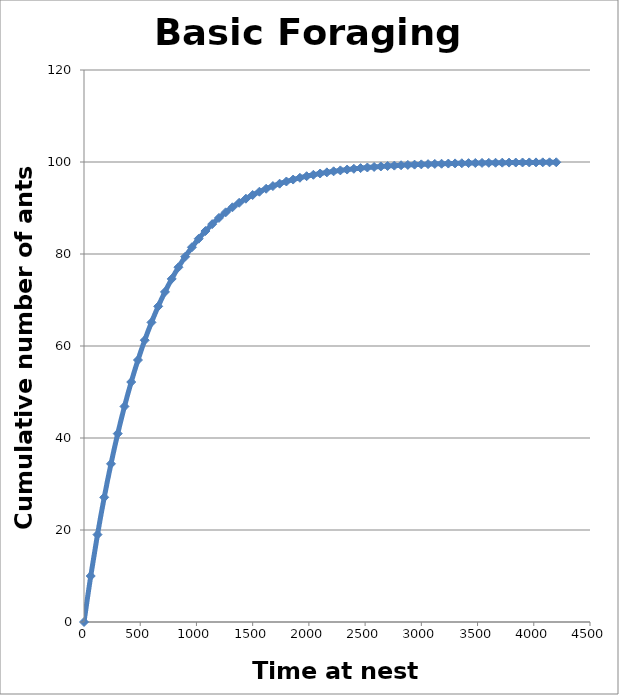
| Category | Series 0 |
|---|---|
| 0.0 | 0 |
| 60.0 | 10 |
| 120.0 | 19 |
| 180.0 | 27.1 |
| 240.0 | 34.39 |
| 300.0 | 40.951 |
| 360.0 | 46.856 |
| 420.0 | 52.17 |
| 480.0 | 56.953 |
| 540.0 | 61.258 |
| 600.0 | 65.132 |
| 660.0 | 68.619 |
| 720.0 | 71.757 |
| 780.0 | 74.581 |
| 840.0 | 77.123 |
| 900.0 | 79.411 |
| 960.0 | 81.47 |
| 1020.0 | 83.323 |
| 1080.0 | 84.991 |
| 1140.0 | 86.491 |
| 1200.0 | 87.842 |
| 1260.0 | 89.058 |
| 1320.0 | 90.152 |
| 1380.0 | 91.137 |
| 1440.0 | 92.023 |
| 1500.0 | 92.821 |
| 1560.0 | 93.539 |
| 1620.0 | 94.185 |
| 1680.0 | 94.767 |
| 1740.0 | 95.29 |
| 1800.0 | 95.761 |
| 1860.0 | 96.185 |
| 1920.0 | 96.566 |
| 1980.0 | 96.91 |
| 2040.0 | 97.219 |
| 2100.0 | 97.497 |
| 2160.0 | 97.747 |
| 2220.0 | 97.972 |
| 2280.0 | 98.175 |
| 2340.0 | 98.358 |
| 2400.0 | 98.522 |
| 2460.0 | 98.67 |
| 2520.0 | 98.803 |
| 2580.0 | 98.922 |
| 2640.0 | 99.03 |
| 2700.0 | 99.127 |
| 2760.0 | 99.214 |
| 2820.0 | 99.293 |
| 2880.0 | 99.364 |
| 2940.0 | 99.427 |
| 3000.0 | 99.485 |
| 3060.0 | 99.536 |
| 3120.0 | 99.583 |
| 3180.0 | 99.624 |
| 3240.0 | 99.662 |
| 3300.0 | 99.696 |
| 3360.0 | 99.726 |
| 3420.0 | 99.753 |
| 3480.0 | 99.778 |
| 3540.0 | 99.8 |
| 3600.0 | 99.82 |
| 3660.0 | 99.838 |
| 3720.0 | 99.854 |
| 3780.0 | 99.869 |
| 3840.0 | 99.882 |
| 3900.0 | 99.894 |
| 3960.0 | 99.904 |
| 4020.0 | 99.914 |
| 4080.0 | 99.923 |
| 4140.0 | 99.93 |
| 4200.0 | 99.937 |